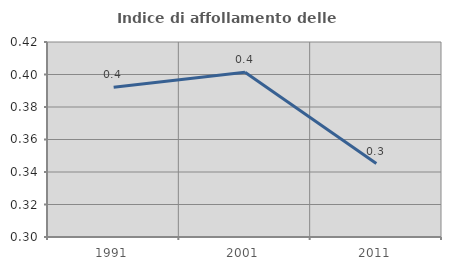
| Category | Indice di affollamento delle abitazioni  |
|---|---|
| 1991.0 | 0.392 |
| 2001.0 | 0.401 |
| 2011.0 | 0.345 |